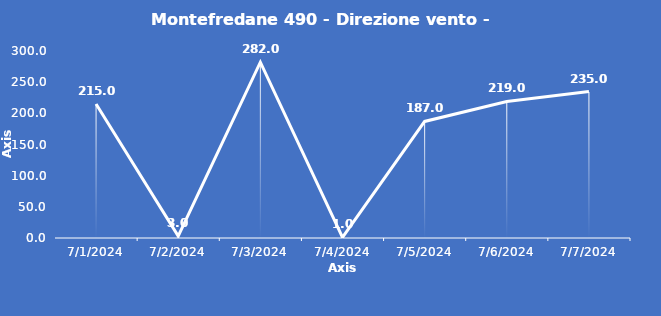
| Category | Montefredane 490 - Direzione vento - Grezzo (°N) |
|---|---|
| 7/1/24 | 215 |
| 7/2/24 | 3 |
| 7/3/24 | 282 |
| 7/4/24 | 1 |
| 7/5/24 | 187 |
| 7/6/24 | 219 |
| 7/7/24 | 235 |